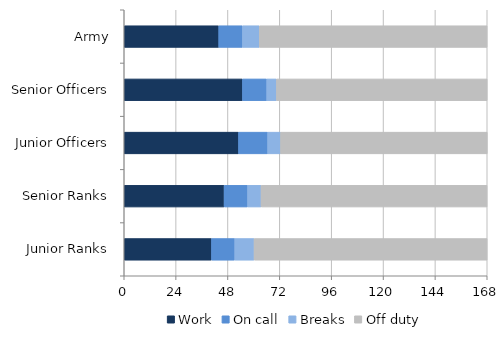
| Category | Work | On call | Breaks | Off duty |
|---|---|---|---|---|
| Army | 43.744 | 11.005 | 7.77 | 105.444 |
| Senior Officers | 54.736 | 11.216 | 4.526 | 97.507 |
| Junior Officers | 52.916 | 13.476 | 5.985 | 95.655 |
| Senior Ranks | 46.229 | 10.882 | 6.23 | 104.606 |
| Junior Ranks | 40.412 | 10.752 | 8.941 | 107.853 |